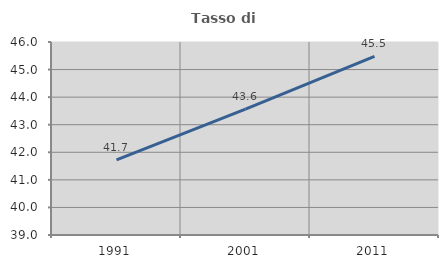
| Category | Tasso di occupazione   |
|---|---|
| 1991.0 | 41.725 |
| 2001.0 | 43.568 |
| 2011.0 | 45.48 |